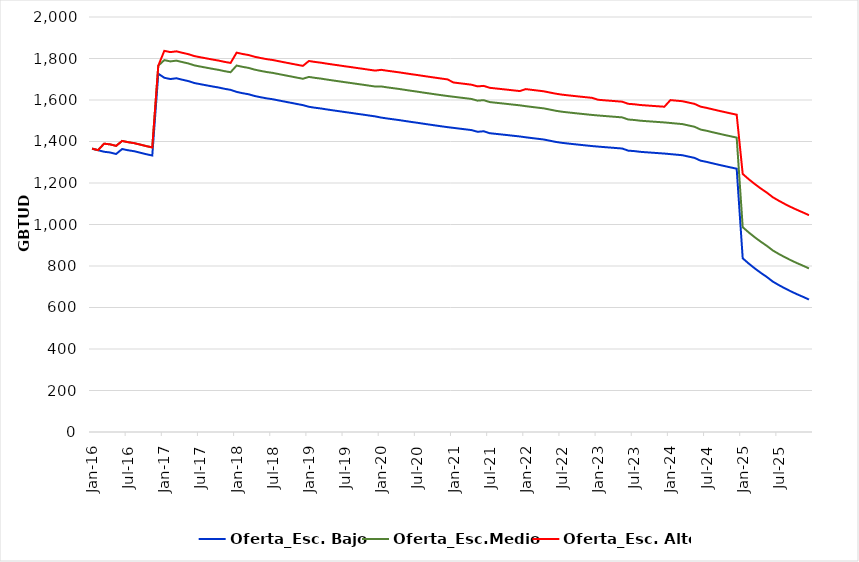
| Category | Oferta_Esc. Bajo | Oferta_Esc.Medio | Oferta_Esc. Alto |
|---|---|---|---|
| 2016-01-01 | 1365.693 | 1365.693 | 1365.693 |
| 2016-02-01 | 1358.267 | 1358.267 | 1358.267 |
| 2016-03-01 | 1350.549 | 1389.549 | 1389.549 |
| 2016-04-01 | 1347.158 | 1386.158 | 1386.158 |
| 2016-05-01 | 1339.854 | 1378.854 | 1378.854 |
| 2016-06-01 | 1363.695 | 1402.695 | 1402.695 |
| 2016-07-01 | 1357.741 | 1396.741 | 1396.741 |
| 2016-08-01 | 1353.09 | 1392.09 | 1392.09 |
| 2016-09-01 | 1346.079 | 1385.079 | 1385.079 |
| 2016-10-01 | 1338.836 | 1377.836 | 1377.836 |
| 2016-11-01 | 1332.486 | 1371.486 | 1371.486 |
| 2016-12-01 | 1726.471 | 1765.471 | 1765.471 |
| 2017-01-01 | 1707.163 | 1792.163 | 1836.94 |
| 2017-02-01 | 1700.984 | 1785.984 | 1830.761 |
| 2017-03-01 | 1704.718 | 1789.718 | 1834.495 |
| 2017-04-01 | 1697.699 | 1782.699 | 1827.476 |
| 2017-05-01 | 1691.052 | 1776.052 | 1820.829 |
| 2017-06-01 | 1681.768 | 1766.768 | 1811.545 |
| 2017-07-01 | 1676.092 | 1761.092 | 1805.869 |
| 2017-08-01 | 1670.654 | 1755.654 | 1800.431 |
| 2017-09-01 | 1665.238 | 1750.238 | 1795.015 |
| 2017-10-01 | 1660.23 | 1745.23 | 1790.007 |
| 2017-11-01 | 1653.994 | 1738.994 | 1783.771 |
| 2017-12-01 | 1648.843 | 1733.843 | 1778.62 |
| 2018-01-01 | 1639.068 | 1766.068 | 1828.112 |
| 2018-02-01 | 1632.718 | 1759.718 | 1821.762 |
| 2018-03-01 | 1627.565 | 1754.565 | 1816.609 |
| 2018-04-01 | 1619.289 | 1746.289 | 1808.333 |
| 2018-05-01 | 1613.269 | 1740.269 | 1802.313 |
| 2018-06-01 | 1607.79 | 1734.79 | 1796.834 |
| 2018-07-01 | 1603.65 | 1730.65 | 1792.694 |
| 2018-08-01 | 1597.871 | 1724.871 | 1786.915 |
| 2018-09-01 | 1592.141 | 1719.141 | 1781.185 |
| 2018-10-01 | 1586.587 | 1713.587 | 1775.631 |
| 2018-11-01 | 1580.884 | 1707.884 | 1769.928 |
| 2018-12-01 | 1575.392 | 1702.392 | 1764.436 |
| 2019-01-01 | 1567.264 | 1711.264 | 1787.947 |
| 2019-02-01 | 1562.763 | 1706.763 | 1783.446 |
| 2019-03-01 | 1559.067 | 1703.067 | 1779.75 |
| 2019-04-01 | 1554.416 | 1698.416 | 1775.099 |
| 2019-05-01 | 1550.133 | 1694.133 | 1770.816 |
| 2019-06-01 | 1546.041 | 1690.041 | 1766.724 |
| 2019-07-01 | 1541.779 | 1685.779 | 1762.462 |
| 2019-08-01 | 1537.772 | 1681.772 | 1758.455 |
| 2019-09-01 | 1533.512 | 1677.512 | 1754.195 |
| 2019-10-01 | 1529.458 | 1673.458 | 1750.141 |
| 2019-11-01 | 1525.175 | 1669.175 | 1745.858 |
| 2019-12-01 | 1521.034 | 1665.034 | 1741.717 |
| 2020-01-01 | 1515.288 | 1665.288 | 1745.404 |
| 2020-02-01 | 1510.868 | 1660.868 | 1740.984 |
| 2020-03-01 | 1507.008 | 1657.008 | 1737.124 |
| 2020-04-01 | 1503.063 | 1653.063 | 1733.179 |
| 2020-05-01 | 1498.637 | 1648.637 | 1728.753 |
| 2020-06-01 | 1494.262 | 1644.262 | 1724.378 |
| 2020-07-01 | 1490.217 | 1640.217 | 1720.333 |
| 2020-08-01 | 1485.741 | 1635.741 | 1715.857 |
| 2020-09-01 | 1481.575 | 1631.575 | 1711.691 |
| 2020-10-01 | 1477.267 | 1627.267 | 1707.383 |
| 2020-11-01 | 1473.17 | 1623.17 | 1703.286 |
| 2020-12-01 | 1469.192 | 1619.192 | 1699.308 |
| 2021-01-01 | 1465.62 | 1615.62 | 1684.393 |
| 2021-02-01 | 1461.996 | 1611.996 | 1680.769 |
| 2021-03-01 | 1458.564 | 1608.564 | 1677.337 |
| 2021-04-01 | 1454.876 | 1604.876 | 1673.649 |
| 2021-05-01 | 1446.791 | 1596.791 | 1665.564 |
| 2021-06-01 | 1449.361 | 1599.361 | 1668.134 |
| 2021-07-01 | 1440.042 | 1590.042 | 1658.815 |
| 2021-08-01 | 1436.883 | 1586.883 | 1655.656 |
| 2021-09-01 | 1433.808 | 1583.808 | 1652.581 |
| 2021-10-01 | 1430.679 | 1580.679 | 1649.452 |
| 2021-11-01 | 1427.455 | 1577.455 | 1646.228 |
| 2021-12-01 | 1424.299 | 1574.299 | 1643.072 |
| 2022-01-01 | 1420.201 | 1570.201 | 1652.536 |
| 2022-02-01 | 1416.563 | 1566.563 | 1648.898 |
| 2022-03-01 | 1413.079 | 1563.079 | 1645.414 |
| 2022-04-01 | 1409.548 | 1559.548 | 1641.883 |
| 2022-05-01 | 1403.727 | 1553.727 | 1636.062 |
| 2022-06-01 | 1397.955 | 1547.955 | 1630.29 |
| 2022-07-01 | 1393.486 | 1543.486 | 1625.821 |
| 2022-08-01 | 1390.24 | 1540.24 | 1622.575 |
| 2022-09-01 | 1387.076 | 1537.076 | 1619.411 |
| 2022-10-01 | 1383.992 | 1533.992 | 1616.327 |
| 2022-11-01 | 1380.987 | 1530.987 | 1613.322 |
| 2022-12-01 | 1377.999 | 1527.999 | 1610.334 |
| 2023-01-01 | 1375.464 | 1525.464 | 1601.136 |
| 2023-02-01 | 1373.064 | 1523.064 | 1598.736 |
| 2023-03-01 | 1370.779 | 1520.779 | 1596.451 |
| 2023-04-01 | 1368.483 | 1518.483 | 1594.155 |
| 2023-05-01 | 1366.2 | 1516.2 | 1591.872 |
| 2023-06-01 | 1355.944 | 1505.944 | 1581.616 |
| 2023-07-01 | 1353.752 | 1503.752 | 1579.424 |
| 2023-08-01 | 1350.232 | 1500.232 | 1575.904 |
| 2023-09-01 | 1348.075 | 1498.075 | 1573.747 |
| 2023-10-01 | 1345.982 | 1495.982 | 1571.654 |
| 2023-11-01 | 1343.924 | 1493.924 | 1569.596 |
| 2023-12-01 | 1341.895 | 1491.895 | 1567.567 |
| 2024-01-01 | 1339.198 | 1489.198 | 1599.535 |
| 2024-02-01 | 1336.474 | 1486.474 | 1596.811 |
| 2024-03-01 | 1333.849 | 1483.849 | 1594.186 |
| 2024-04-01 | 1327.339 | 1477.339 | 1587.676 |
| 2024-05-01 | 1321.038 | 1471.038 | 1581.375 |
| 2024-06-01 | 1307.677 | 1457.677 | 1568.014 |
| 2024-07-01 | 1301.736 | 1451.736 | 1562.073 |
| 2024-08-01 | 1294.783 | 1444.783 | 1555.12 |
| 2024-09-01 | 1288.039 | 1438.039 | 1548.376 |
| 2024-10-01 | 1281.48 | 1431.48 | 1541.817 |
| 2024-11-01 | 1275.07 | 1425.07 | 1535.407 |
| 2024-12-01 | 1268.855 | 1418.855 | 1529.192 |
| 2025-01-01 | 837.044 | 987.044 | 1243.568 |
| 2025-02-01 | 811.734 | 961.734 | 1218.258 |
| 2025-03-01 | 788.486 | 938.486 | 1195.01 |
| 2025-04-01 | 767.008 | 917.008 | 1173.532 |
| 2025-05-01 | 747.191 | 897.191 | 1153.715 |
| 2025-06-01 | 724.805 | 874.805 | 1131.329 |
| 2025-07-01 | 707.894 | 857.894 | 1114.418 |
| 2025-08-01 | 692.212 | 842.212 | 1098.736 |
| 2025-09-01 | 677.625 | 827.625 | 1084.149 |
| 2025-10-01 | 664.112 | 814.112 | 1070.636 |
| 2025-11-01 | 651.541 | 801.541 | 1058.065 |
| 2025-12-01 | 638.36 | 788.36 | 1044.884 |